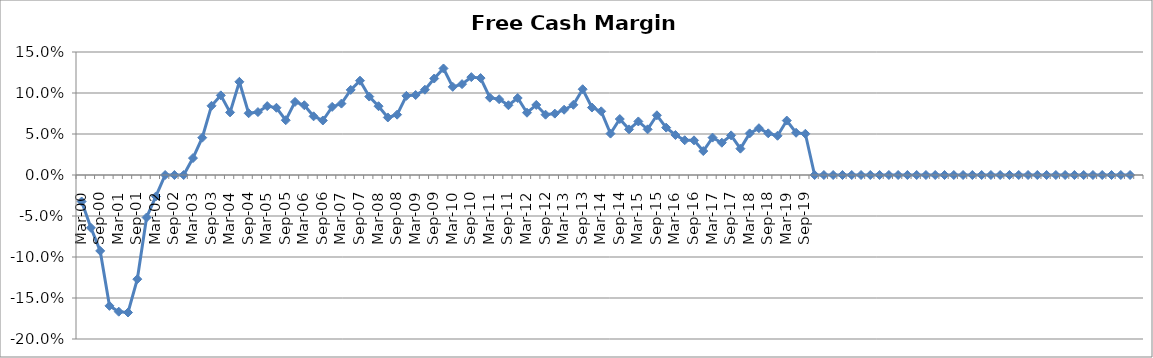
| Category | Revenue ($Millions) |
|---|---|
| Mar-00 | -0.032 |
| Jun-00 | -0.064 |
| Sep-00 | -0.093 |
| Dec-00 | -0.16 |
| Mar-01 | -0.167 |
| Jun-01 | -0.168 |
| Sep-01 | -0.127 |
| Dec-01 | -0.052 |
| Mar-02 | -0.026 |
| Jun-02 | 0 |
| Sep-02 | 0 |
| Dec-02 | 0 |
| Mar-03 | 0.021 |
| Jun-03 | 0.046 |
| Sep-03 | 0.084 |
| Dec-03 | 0.097 |
| Mar-04 | 0.076 |
| Jun-04 | 0.114 |
| Sep-04 | 0.075 |
| Dec-04 | 0.077 |
| Mar-05 | 0.084 |
| Jun-05 | 0.082 |
| Sep-05 | 0.067 |
| Dec-05 | 0.089 |
| Mar-06 | 0.085 |
| Jun-06 | 0.072 |
| Sep-06 | 0.066 |
| Dec-06 | 0.083 |
| Mar-07 | 0.087 |
| Jun-07 | 0.104 |
| Sep-07 | 0.115 |
| Dec-07 | 0.096 |
| Mar-08 | 0.084 |
| Jun-08 | 0.07 |
| Sep-08 | 0.074 |
| Dec-08 | 0.097 |
| Mar-09 | 0.098 |
| Jun-09 | 0.104 |
| Sep-09 | 0.118 |
| Dec-09 | 0.13 |
| Mar-10 | 0.108 |
| Jun-10 | 0.111 |
| Sep-10 | 0.119 |
| Dec-10 | 0.118 |
| Mar-11 | 0.094 |
| Jun-11 | 0.092 |
| Sep-11 | 0.085 |
| Dec-11 | 0.094 |
| Mar-12 | 0.076 |
| Jun-12 | 0.085 |
| Sep-12 | 0.074 |
| Dec-12 | 0.075 |
| Mar-13 | 0.08 |
| Jun-13 | 0.086 |
| Sep-13 | 0.105 |
| Dec-13 | 0.082 |
| Mar-14 | 0.078 |
| Jun-14 | 0.05 |
| Sep-14 | 0.068 |
| Dec-14 | 0.056 |
| Mar-15 | 0.065 |
| Jun-15 | 0.056 |
| Sep-15 | 0.073 |
| Dec-15 | 0.058 |
| Mar-16 | 0.049 |
| Jun-16 | 0.042 |
| Sep-16 | 0.042 |
| Dec-16 | 0.029 |
| Mar-17 | 0.046 |
| Jun-17 | 0.039 |
| Sep-17 | 0.048 |
| Dec-17 | 0.032 |
| Mar-18 | 0.051 |
| Jun-18 | 0.057 |
| Sep-18 | 0.051 |
| Dec-18 | 0.048 |
| Mar-19 | 0.066 |
| Jun-19 | 0.051 |
| Sep-19 | 0.05 |